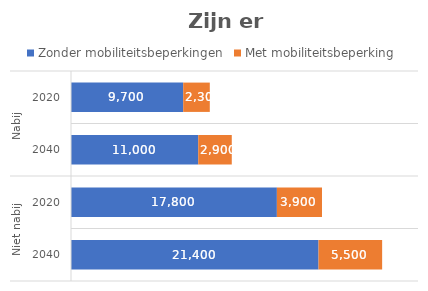
| Category | Zonder mobiliteitsbeperkingen | Met mobiliteitsbeperking |
|---|---|---|
| 0 | 21400 | 5500 |
| 1 | 17800 | 3900 |
| 2 | 11000 | 2900 |
| 3 | 9700 | 2300 |